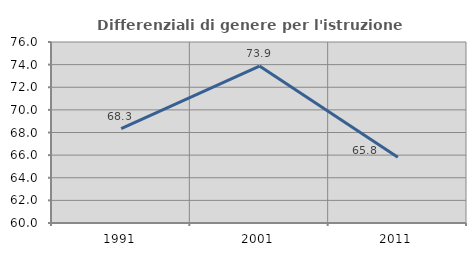
| Category | Differenziali di genere per l'istruzione superiore |
|---|---|
| 1991.0 | 68.346 |
| 2001.0 | 73.873 |
| 2011.0 | 65.807 |